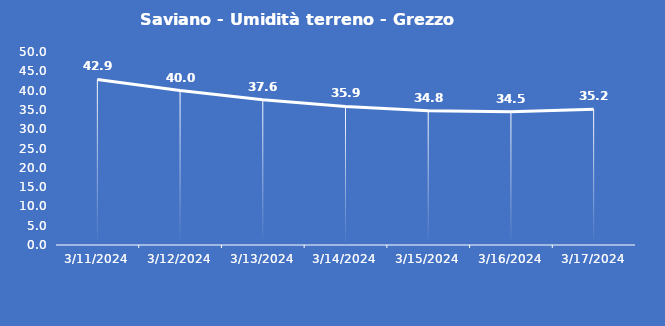
| Category | Saviano - Umidità terreno - Grezzo (%VWC) |
|---|---|
| 3/11/24 | 42.9 |
| 3/12/24 | 40 |
| 3/13/24 | 37.6 |
| 3/14/24 | 35.9 |
| 3/15/24 | 34.8 |
| 3/16/24 | 34.5 |
| 3/17/24 | 35.2 |